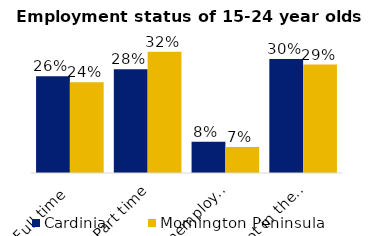
| Category | Cardinia | Mornington Peninsula |
|---|---|---|
| Full time | 0.256 | 0.241 |
| Part time | 0.275 | 0.322 |
| Unemployed | 0.083 | 0.069 |
| Not in the labor force | 0.302 | 0.288 |